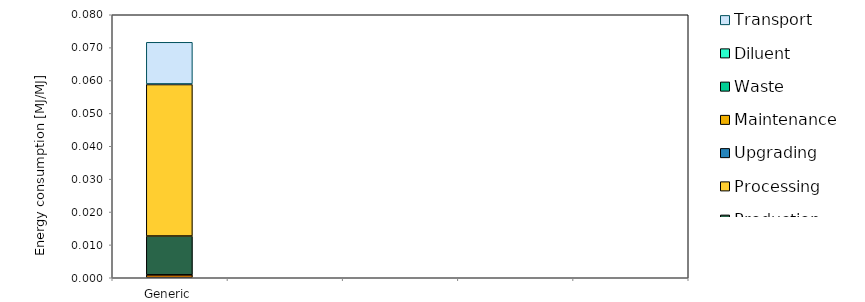
| Category | Exploration | Drilling | Production | Processing | Upgrading | Maintenance | Waste | Diluent | Transport |
|---|---|---|---|---|---|---|---|---|---|
| Generic | 0 | 0.001 | 0.012 | 0.046 | 0 | 0 | 0 | 0 | 0.013 |